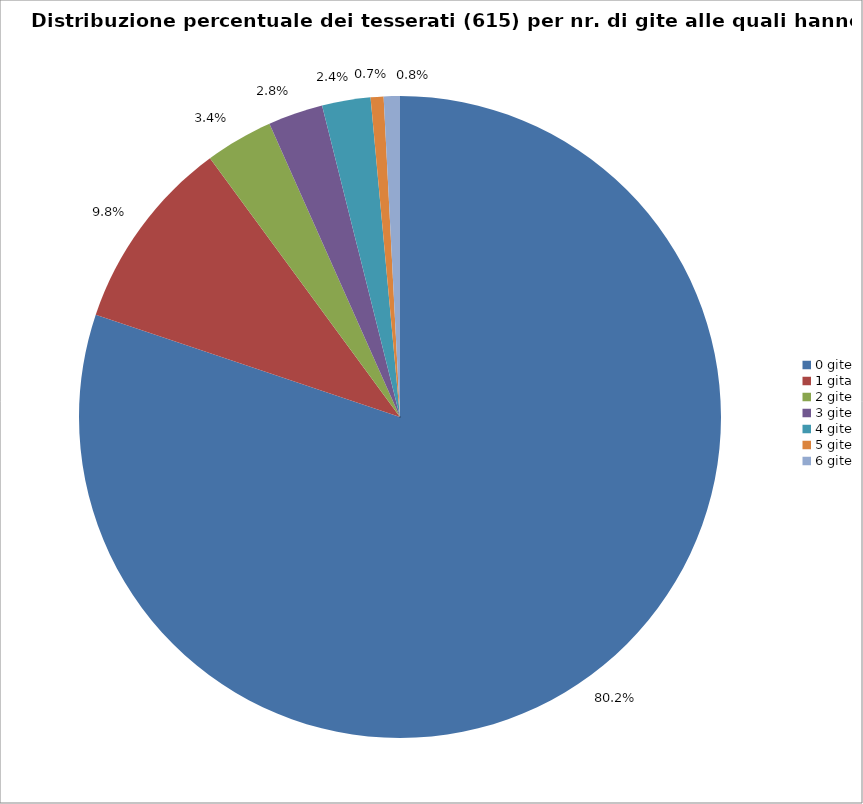
| Category | Nr. Tesserati |
|---|---|
| 0 gite | 493 |
| 1 gita | 60 |
| 2 gite | 21 |
| 3 gite | 17 |
| 4 gite | 15 |
| 5 gite | 4 |
| 6 gite | 5 |